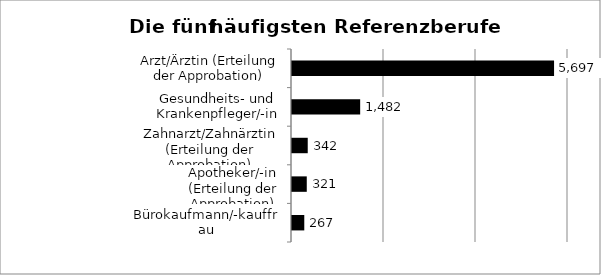
| Category | Spalte1 |
|---|---|
| Bürokaufmann/-kauffrau | 267 |
| Apotheker/-in (Erteilung der Approbation) | 321 |
| Zahnarzt/Zahnärztin (Erteilung der Approbation) | 342 |
| Gesundheits- und Krankenpfleger/-in | 1482 |
| Arzt/Ärztin (Erteilung der Approbation) | 5697 |